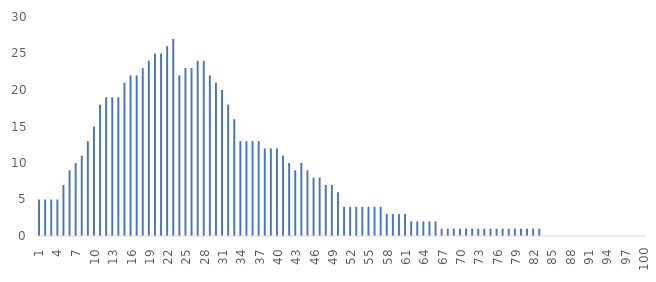
| Category | Observations |
|---|---|
| 1.0 | 5 |
| 2.0 | 5 |
| 3.0 | 5 |
| 4.0 | 5 |
| 5.0 | 7 |
| 6.0 | 9 |
| 7.0 | 10 |
| 8.0 | 11 |
| 9.0 | 13 |
| 10.0 | 15 |
| 11.0 | 18 |
| 12.0 | 19 |
| 13.0 | 19 |
| 14.0 | 19 |
| 15.0 | 21 |
| 16.0 | 22 |
| 17.0 | 22 |
| 18.0 | 23 |
| 19.0 | 24 |
| 20.0 | 25 |
| 21.0 | 25 |
| 22.0 | 26 |
| 23.0 | 27 |
| 24.0 | 22 |
| 25.0 | 23 |
| 26.0 | 23 |
| 27.0 | 24 |
| 28.0 | 24 |
| 29.0 | 22 |
| 30.0 | 21 |
| 31.0 | 20 |
| 32.0 | 18 |
| 33.0 | 16 |
| 34.0 | 13 |
| 35.0 | 13 |
| 36.0 | 13 |
| 37.0 | 13 |
| 38.0 | 12 |
| 39.0 | 12 |
| 40.0 | 12 |
| 41.0 | 11 |
| 42.0 | 10 |
| 43.0 | 9 |
| 44.0 | 10 |
| 45.0 | 9 |
| 46.0 | 8 |
| 47.0 | 8 |
| 48.0 | 7 |
| 49.0 | 7 |
| 50.0 | 6 |
| 51.0 | 4 |
| 52.0 | 4 |
| 53.0 | 4 |
| 54.0 | 4 |
| 55.0 | 4 |
| 56.0 | 4 |
| 57.0 | 4 |
| 58.0 | 3 |
| 59.0 | 3 |
| 60.0 | 3 |
| 61.0 | 3 |
| 62.0 | 2 |
| 63.0 | 2 |
| 64.0 | 2 |
| 65.0 | 2 |
| 66.0 | 2 |
| 67.0 | 1 |
| 68.0 | 1 |
| 69.0 | 1 |
| 70.0 | 1 |
| 71.0 | 1 |
| 72.0 | 1 |
| 73.0 | 1 |
| 74.0 | 1 |
| 75.0 | 1 |
| 76.0 | 1 |
| 77.0 | 1 |
| 78.0 | 1 |
| 79.0 | 1 |
| 80.0 | 1 |
| 81.0 | 1 |
| 82.0 | 1 |
| 83.0 | 1 |
| 84.0 | 0 |
| 85.0 | 0 |
| 86.0 | 0 |
| 87.0 | 0 |
| 88.0 | 0 |
| 89.0 | 0 |
| 90.0 | 0 |
| 91.0 | 0 |
| 92.0 | 0 |
| 93.0 | 0 |
| 94.0 | 0 |
| 95.0 | 0 |
| 96.0 | 0 |
| 97.0 | 0 |
| 98.0 | 0 |
| 99.0 | 0 |
| 100.0 | 0 |